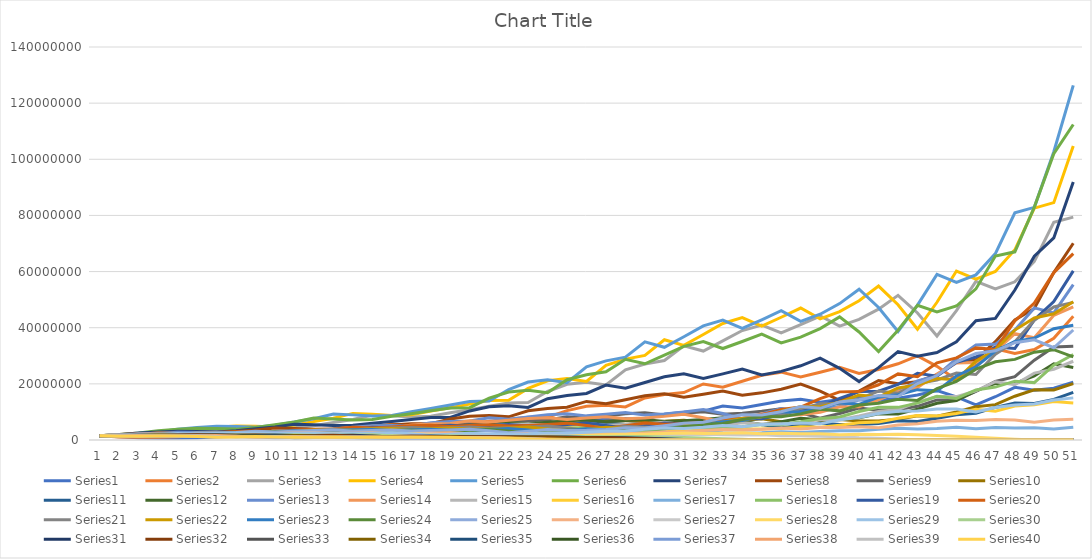
| Category | Series 0 | Series 1 | Series 2 | Series 3 | Series 4 | Series 5 | Series 6 | Series 7 | Series 8 | Series 9 | Series 10 | Series 11 | Series 12 | Series 13 | Series 14 | Series 15 | Series 16 | Series 17 | Series 18 | Series 19 | Series 20 | Series 21 | Series 22 | Series 23 | Series 24 | Series 25 | Series 26 | Series 27 | Series 28 | Series 29 | Series 30 | Series 31 | Series 32 | Series 33 | Series 34 | Series 35 | Series 36 | Series 37 | Series 38 | Series 39 |
|---|---|---|---|---|---|---|---|---|---|---|---|---|---|---|---|---|---|---|---|---|---|---|---|---|---|---|---|---|---|---|---|---|---|---|---|---|---|---|---|---|
| 0 | 1500000 | 1500000 | 1500000 | 1500000 | 1500000 | 1500000 | 1500000 | 1500000 | 1500000 | 1500000 | 1500000 | 1500000 | 1500000 | 1500000 | 1500000 | 1500000 | 1500000 | 1500000 | 1500000 | 1500000 | 1500000 | 1500000 | 1500000 | 1500000 | 1500000 | 1500000 | 1500000 | 1500000 | 1500000 | 1500000 | 1500000 | 1500000 | 1500000 | 1500000 | 1500000 | 1500000 | 1500000 | 1500000 | 1500000 | 1500000 |
| 1 | 1134576 | 1059408 | 1413792 | 1538352 | 1732752 | 1948752 | 1891152 | 1949904 | 1715184 | 1588464 | 1442304 | 1383696 | 1679328 | 1798272 | 1718928 | 1773072 | 1405296 | 1390032 | 1495440 | 1677600 | 1622736 | 1617408 | 1598256 | 1466928 | 1884384 | 1663776 | 1503792 | 1378080 | 1849968 | 1567584 | 1514448 | 1713168 | 1365552 | 1611648 | 1596240 | 1518336 | 1344816 | 1557504 | 1553904 | 1327248 |
| 2 | 794508.387 | 987287.105 | 1449584.234 | 1776388.918 | 2261662.356 | 2479684.665 | 2476535.729 | 2252513.849 | 1826694.554 | 1530477.456 | 1325306.334 | 1536051.606 | 2017744.064 | 2073802.851 | 2040958.206 | 1666823.842 | 1290280.17 | 1376446.944 | 1672966.006 | 1822139.791 | 1749967.989 | 1727049.266 | 1566522.589 | 1840861.535 | 2108086.916 | 1673867.708 | 1379790.25 | 1691233.685 | 1947899.026 | 1584606.081 | 1729592.481 | 1567017.136 | 1460341.336 | 1719151.204 | 1618808.615 | 1360250.523 | 1387857.559 | 1613190.749 | 1373910.508 | 1344624.73 |
| 3 | 731928.376 | 1000209.173 | 1673453.928 | 2317818.884 | 2888597.417 | 3272597.959 | 2877176.102 | 2420747.775 | 1769876.652 | 1409596.472 | 1463986.809 | 1830147.983 | 2331441.271 | 2476678.746 | 1926809.735 | 1537117.374 | 1263199.189 | 1529016.345 | 1817581.082 | 1973149.612 | 1868823.93 | 1696319.77 | 1970548.273 | 2057585.835 | 2138039.289 | 1541647.755 | 1690784.846 | 1773300.256 | 1983936.333 | 1812007.674 | 1581975.948 | 1685006.137 | 1550592.718 | 1747584.272 | 1453166.883 | 1402540.621 | 1428253.316 | 1426063.673 | 1390582.86 | 1391917.285 |
| 4 | 732278.317 | 1140017.458 | 2182991.184 | 2959507.087 | 3824133.077 | 3824616.197 | 3107428.082 | 2366091.785 | 1640429.284 | 1561699.374 | 1735647.634 | 2099082.258 | 2789324.759 | 2350966.008 | 1786447.627 | 1513033.61 | 1386356.218 | 1650159.668 | 1968742.399 | 2115736.072 | 1835791.76 | 2138591.033 | 2206859.983 | 2085103.514 | 1986028.237 | 1897475.205 | 1770546.885 | 1798545.884 | 2286351.073 | 1659281.783 | 1701011.386 | 1798816.138 | 1569049.318 | 1572680.535 | 1501949.845 | 1442005.836 | 1253920.593 | 1443029.835 | 1438017.564 | 1468976.07 |
| 5 | 823291.224 | 1469507.211 | 2786824.661 | 3917113.781 | 4479676.461 | 4151864.04 | 3051690.005 | 2214554.063 | 1831965.663 | 1857005.448 | 1981899.664 | 2494332.524 | 2652135.977 | 2194682.47 | 1770069.844 | 1670185.637 | 1478907.695 | 1775099.474 | 2111565.254 | 2086583.548 | 2314720.646 | 2399423.1 | 2240471.214 | 1935181.665 | 2468602.876 | 1994481.839 | 1793430.266 | 2063774.169 | 2108504.869 | 1786518.257 | 1815819.017 | 1829986.154 | 1405210.522 | 1630323.188 | 1548145.318 | 1264711.854 | 1257809.365 | 1491873.169 | 1515996.113 | 1231165.793 |
| 6 | 1047426.927 | 1858057.316 | 3687976.111 | 4587807.597 | 4872748.766 | 4097170.425 | 2871146.199 | 2503154.594 | 2195727.108 | 2126117.803 | 2345427.511 | 2356611.036 | 2480942.408 | 2192627.745 | 1967529.616 | 1791687.9 | 1571473.734 | 1890986.01 | 2083001.658 | 2641956.31 | 2597302.884 | 2440102.648 | 2083376.771 | 2403022.354 | 2616410.052 | 2027895.648 | 2055150.047 | 1895807.469 | 2288575.698 | 1909586.415 | 1847199.971 | 1648178.675 | 1448311.324 | 1685744.391 | 1361520.003 | 1266988.89 | 1288006.366 | 1572350.467 | 1269125.777 | 946529.586 |
| 7 | 1310156.705 | 2439156.728 | 4318924.885 | 4989635.022 | 4817642.689 | 3875116.406 | 3265911.755 | 3035774.071 | 2531628.424 | 2522321.084 | 2207324.202 | 2187025.472 | 2484742.186 | 2458260.961 | 2124708.304 | 1915190.834 | 1653585.835 | 1853064.931 | 2638128.43 | 2974554.118 | 2641591.104 | 2273039.288 | 2592730.407 | 2544798.327 | 2682172.245 | 2332896.437 | 1885581.886 | 2048579.887 | 2465401.835 | 1945085.645 | 1663603.172 | 1710247.783 | 1488423.768 | 1487508.591 | 1368745.795 | 1295543.853 | 1343763.993 | 1315928.753 | 974134.943 | 1074677.761 |
| 8 | 1704107.847 | 2839060.946 | 4696726.24 | 4932527.346 | 4565839.1 | 4435891.098 | 3984945.686 | 3536205.57 | 3022869.654 | 2379368.097 | 2038426.47 | 2169491.742 | 2792834.698 | 2676199.24 | 2287028.464 | 2027398.661 | 1600680.451 | 2330490.552 | 2970888.037 | 3034786.65 | 2460979.549 | 2834480.165 | 2750734.027 | 2606641.798 | 3111511.904 | 2148003.17 | 2034689.17 | 2197415.557 | 2530446.295 | 1754121.993 | 1726155.476 | 1770186.926 | 1304816.99 | 1501775.655 | 1405005.964 | 1349543.087 | 1112431.666 | 1009650.569 | 1103215.254 | 1210898.483 |
| 9 | 1969458.961 | 3071239.672 | 4642529.715 | 4674024.664 | 5239286.091 | 5445050.545 | 4665967.861 | 4261718.214 | 2868922.417 | 2203836.785 | 2009966.954 | 2414439.034 | 3047618.262 | 2904835.21 | 2437866.741 | 1974378.239 | 1986632.268 | 2609506.562 | 3031652.486 | 2836540.45 | 3069191.422 | 3012268.28 | 2822655.389 | 3021405.921 | 2886543.778 | 2327237.305 | 2179563.852 | 2245996.44 | 2300159.703 | 1822993.428 | 1786546.219 | 1563714.157 | 1306388.484 | 1548758.162 | 1469634.096 | 1115345.233 | 840210.38 | 1142709.595 | 1239830.204 | 1063070.907 |
| 10 | 2117388.207 | 3020799.477 | 4398774.294 | 5362480.862 | 6445917.945 | 6407957.174 | 5649351.298 | 4079559.202 | 2677613.079 | 2180976.682 | 2222810.609 | 2610322.444 | 3315979.689 | 3121925.187 | 2390454.44 | 2466497.417 | 2200249.025 | 2648814.161 | 2834198.597 | 3550671.606 | 3262009.812 | 3096108.81 | 3277746.752 | 2800896.7 | 3154026.5 | 2502696.11 | 2224802.517 | 2032791.955 | 2412837.232 | 1889933.831 | 1578065.848 | 1580872.834 | 1334949.844 | 1628036.428 | 1220047.78 | 840346.453 | 927244.555 | 1283377.442 | 1085557.611 | 1007253.046 |
| 11 | 2070366.16 | 2846864.509 | 5046072.256 | 6596391.967 | 7600349.012 | 7793273.344 | 5430789.992 | 3848101.439 | 2674394.648 | 2421182.771 | 2388722.734 | 2813110.502 | 3572156.63 | 3085782.384 | 3008310.427 | 2746623.903 | 2210448.325 | 2462663.26 | 3548569.82 | 3785290.733 | 3353111.053 | 3601242.503 | 3043459.957 | 3057931.831 | 3419407.147 | 2564394.853 | 2010835.52 | 2121604.982 | 2525653.441 | 1672358.129 | 1595255.198 | 1632760.125 | 1389603.341 | 1358742.615 | 925260.726 | 923660.193 | 1014078.596 | 1122927.05 | 1024797.782 | 1008857.299 |
| 12 | 1938579.205 | 3244865.379 | 6206467.558 | 7776694.249 | 9258993.05 | 7522192.878 | 5149094.992 | 3892102.505 | 2997571.421 | 2611433.122 | 2558131.709 | 3002198.633 | 3538790.722 | 3916254.851 | 3370288.835 | 2773630.33 | 2032750.533 | 3064143.712 | 3783778.871 | 3902604.195 | 3900537.205 | 3348753.373 | 3328781.627 | 3312647.005 | 3531182.925 | 2326960.426 | 2095281.842 | 2209254.904 | 2257597.519 | 1694360.301 | 1647472.115 | 1719039.412 | 1147565.372 | 1038361.371 | 1027922.338 | 1005744.256 | 862533.185 | 1059092.705 | 1021415.508 | 1071433.249 |
| 13 | 2192335.38 | 3966913.663 | 7316299.883 | 9472671.334 | 8950463.106 | 7166963.725 | 5239303.688 | 4418595.884 | 3262487.639 | 2807382.127 | 2713054.748 | 2947233.995 | 4501790.849 | 4417600.599 | 3422771.031 | 2564710.303 | 2497497.255 | 3250343.019 | 3901774.936 | 4553307.198 | 3627362.901 | 3668700.505 | 3612255.055 | 3418383.899 | 3230033.549 | 2435988.02 | 2178170.749 | 1964054.463 | 2316195.64 | 1754073.712 | 1734370.751 | 1437098.333 | 863640.612 | 1167835.06 | 1132242.937 | 851333.875 | 781419.443 | 1054282.038 | 1077801.927 | 949473.205 |
| 14 | 2660131.01 | 4652458.789 | 8911124.125 | 9156020.762 | 8543267.888 | 7333745.289 | 5983774.194 | 4866181.731 | 3540282.958 | 2988790.304 | 2646998.946 | 3713582.012 | 5087727.304 | 4514893.759 | 3183899.399 | 3171245.084 | 2621219.847 | 3334791.503 | 4553190.434 | 4245608.693 | 3974293.174 | 3987284.134 | 3733682.89 | 3124479.648 | 3412977.755 | 2544563.311 | 1932991.1 | 2001521.803 | 2430210.875 | 1851315.054 | 1449774.613 | 1100874.829 | 947483.427 | 1303102.483 | 970542.54 | 765795.169 | 734902.219 | 1110646.148 | 947667.397 | 985982.461 |
| 15 | 3099952.258 | 5641173.821 | 8612594.826 | 8738331.118 | 8760250.731 | 8422559.892 | 6625765.841 | 5344069.55 | 3803890.816 | 2927051.046 | 3313369.929 | 4164618.321 | 5208832.81 | 4227559.866 | 3963906.024 | 3346392.772 | 2661113.942 | 3871825.775 | 4246199.591 | 4665306.67 | 4319787.148 | 4127402.284 | 3418382.864 | 3298559.638 | 3599067.881 | 2269556.993 | 1965522.102 | 2085092.374 | 2600794.171 | 1551726.48 | 1110431.757 | 1242851.396 | 1029571.681 | 1132484.674 | 889271.863 | 712569.813 | 714112.416 | 974569.815 | 972995.019 | 1017073.397 |
| 16 | 3737379.098 | 5430079.906 | 8218953.227 | 8958929.321 | 10081343.223 | 9372822.188 | 7315902.692 | 5808457.832 | 3758924.305 | 3678764.072 | 3695764.337 | 4233440.06 | 4886096.458 | 5302626.676 | 4206877.228 | 3415673.164 | 3056598.805 | 3594556.548 | 4666806.339 | 5084845.534 | 4471957.674 | 3784516.008 | 3615785.338 | 3475338.158 | 3241705.496 | 2322237.66 | 2042749.382 | 2215113.592 | 2211727.828 | 1193107.675 | 1253366.886 | 1392268.389 | 869526.977 | 1058129.6 | 850277.899 | 681107.28 | 561870.42 | 997645.491 | 990028.75 | 937805.811 |
| 17 | 3578878.388 | 5156635.683 | 8425569.64 | 10308477.208 | 11239078.36 | 10400094.21 | 7992415.3 | 5803330.997 | 4769325.417 | 4116988.04 | 3737898.121 | 3941858.945 | 6140976.81 | 5662436.816 | 4318286.092 | 3945031.072 | 2810383.176 | 3930909.884 | 5087348.858 | 5277736.531 | 4100789.101 | 4009936.466 | 3816969.789 | 3127428.581 | 3356862.245 | 2429657.235 | 2164804.653 | 1869451.932 | 1735246.886 | 1354867.961 | 1403731.507 | 1214959.586 | 779513.918 | 1039960.37 | 846860.608 | 522693.525 | 477634.153 | 1011420.265 | 897592.943 | 979228.428 |
| 18 | 3377264.999 | 5256665.143 | 9693794.556 | 11490805.162 | 12493019.19 | 11414243.383 | 8023890.375 | 7447669.677 | 5378758.887 | 4176907.821 | 3462021.078 | 4913039.427 | 6568498.29 | 5847361.497 | 5016173.049 | 3645408.427 | 3040007.836 | 4265009.642 | 5281188.614 | 4852485.976 | 4345462.422 | 4240364.879 | 3441691.951 | 3234984.209 | 3556432.447 | 2592671.37 | 1822300.582 | 1451354.689 | 2032116.368 | 1526866.757 | 1224675.073 | 1141689.95 | 721618.803 | 1076874.26 | 690429.469 | 422140.572 | 362704.131 | 912799.435 | 915190.55 | 947141.779 |
| 19 | 3417586.932 | 6014587.878 | 10804652.276 | 12771210.708 | 13733892.108 | 11508488.846 | 10348032.564 | 8475988.87 | 5496168.364 | 3881325.458 | 4288863.139 | 5219033.436 | 6793829.959 | 6833328.537 | 4658997.139 | 3965636.526 | 3264148.336 | 4407738.677 | 4856451.291 | 5157521.744 | 4595611.698 | 3830193.618 | 3568604.756 | 3423424.919 | 3843569.695 | 2198232.901 | 1409668.076 | 1672917.498 | 2360859.969 | 1340702.813 | 1150445.714 | 1130874.18 | 684197.747 | 924798.813 | 627427.646 | 287271.164 | 188935.368 | 924547.833 | 859726.215 | 778651.95 |
| 20 | 3881835.932 | 6670842.24 | 12007547.147 | 14038060.268 | 13868471.891 | 14906408.897 | 11822259.847 | 8733056.64 | 5145366.643 | 4826401.748 | 4532940.073 | 5362117.794 | 7951983.158 | 6380604.075 | 5097445.95 | 4281248.422 | 3339582.573 | 4034919.278 | 5162693.111 | 5470889.553 | 4151481.879 | 3979842.683 | 3785864.481 | 3695621.742 | 3301394.998 | 1717582.083 | 1615926.156 | 1913768.794 | 2136961.505 | 1270613.973 | 1139044.49 | 1183461.094 | 518462.308 | 916361.167 | 537229.273 | 99021.684 | 0 | 861242.421 | 678860.153 | 679506.181 |
| 21 | 4277001.175 | 7377662.015 | 13197568.464 | 14174074.659 | 17990761.425 | 17087626.216 | 12223155.191 | 8245389.886 | 6452396.248 | 5117127.373 | 4634069.399 | 6234406.484 | 7435488.211 | 7022354.748 | 5533252.033 | 4403355.755 | 3025645.546 | 4267200.163 | 5477388.027 | 4957310.849 | 4314188.299 | 4231349.423 | 4097044.393 | 3170676.933 | 2625407.462 | 1999105.21 | 1838453.943 | 1706164.482 | 2107804.376 | 1273046.209 | 1191305.213 | 1029979.643 | 407349.928 | 891219.553 | 372253.988 | 0 | 0 | 671847.352 | 551370.138 | 579720.461 |
| 22 | 4699174.187 | 8072210.366 | 13324433.938 | 18385192.455 | 20647834.584 | 17720509.457 | 11581235.708 | 10438197.133 | 6888965.978 | 5247501.314 | 5360833.962 | 5795200.436 | 8195888.405 | 7665093.806 | 5720949.156 | 4011204.347 | 3161616.494 | 4503858.576 | 4964127.468 | 5170472.842 | 4587375.217 | 4589097.455 | 3523895.16 | 2517583.486 | 3135942.707 | 2308780.512 | 1630012.261 | 1650190.523 | 2221877.983 | 1352576.609 | 1036040.401 | 1041586.955 | 259245.176 | 761276.175 | 211010.672 | 0 | 0 | 533109.638 | 410439.025 | 355728.089 |
| 23 | 5109740.933 | 8115585.98 | 17281816.346 | 21098734.602 | 21435266.909 | 16841003.069 | 14717995.866 | 11230648.648 | 7112689.684 | 6089538.751 | 4960811.66 | 6346325.849 | 8958841.165 | 7966908.234 | 5239406.246 | 4218195.005 | 3296307.615 | 4060336.944 | 5178736.112 | 5518505.212 | 4975818.372 | 3955721.879 | 2807434.049 | 3000499.967 | 3711622.677 | 2077787.717 | 1565083.611 | 1697627.531 | 2513553.148 | 1199221.245 | 1046552.478 | 1040045.459 | 58887.517 | 707600.474 | 0 | 0 | 0 | 377126.431 | 179857.963 | 164417.716 |
| 24 | 5107327.088 | 10481437.429 | 19831345.846 | 21901713.702 | 20393025.638 | 21473563.197 | 15884705.391 | 11681522.895 | 8310549.274 | 5650959.005 | 5405332.795 | 6894805.871 | 9324160.704 | 7335214.988 | 5543882.256 | 4426680.629 | 2934261.638 | 4209175.53 | 5528580.581 | 6008024.045 | 4289581.463 | 3160608.36 | 3362102.545 | 3544052.107 | 3419548.155 | 2034368.047 | 1595116.129 | 1865195.028 | 2391919.726 | 1246239.152 | 1043536.201 | 920499.066 | 0 | 583543.418 | 0 | 0 | 0 | 138124.18 | 0 | 0 |
| 25 | 6557211.425 | 11988204.58 | 20585017.781 | 20835221.701 | 26032708.974 | 23237398.754 | 16571359.925 | 13749160.607 | 7758753.285 | 6176690.166 | 5844547.739 | 7134511.956 | 8596480.4 | 7808694.536 | 5854383.539 | 3967315.906 | 2995055.851 | 4464462.541 | 6020341.885 | 5198618.218 | 3427904.683 | 3800736.073 | 3988840.841 | 3258913.983 | 3447940.192 | 2125167.912 | 1732327.02 | 1719450.282 | 2729244.769 | 1286648.622 | 921891.751 | 905604.445 | 0 | 369160.404 | 0 | 0 | 0 | 0 | 0 | 0 |
| 26 | 7465055.368 | 12407287.305 | 19581619.609 | 26595015.14 | 28196943.373 | 24302798.379 | 19561072.363 | 12918665.192 | 8537657.233 | 6698538.569 | 6020194.179 | 6539404.909 | 9165413.054 | 8296246.817 | 5280665.837 | 4083461.012 | 3125479.342 | 4830370.621 | 5210436.356 | 4174671.862 | 4123098.359 | 4526323.088 | 3683160.825 | 3278282.299 | 3730653.517 | 2378664.138 | 1576051.585 | 1884864.143 | 3116638.305 | 1187615.702 | 904423.066 | 811742.46 | 0 | 159617.123 | 0 | 0 | 0 | 0 | 0 | 0 |
| 27 | 7693766.105 | 11767712.132 | 24993443.202 | 28804119.971 | 29515280.141 | 28757576.429 | 18425642.482 | 14315590.013 | 9317600.245 | 6919619.005 | 5492424.466 | 6926003.548 | 9752514.674 | 7529443.467 | 5477732.875 | 4299046.527 | 3326284.342 | 4153726.184 | 4185386.838 | 5056079.136 | 4911235 | 4194116.186 | 3723842.276 | 3537450.666 | 4347300.701 | 2237983.045 | 1697683.04 | 2066253.532 | 3211021.948 | 1241868.665 | 807554.543 | 596976.511 | 0 | 0 | 0 | 0 | 0 | 0 | 0 | 0 |
| 28 | 7266345.929 | 14971714.041 | 27068292.711 | 30148995.939 | 34954897.131 | 27145406.122 | 20473671.614 | 15725407.3 | 9683022.238 | 6331463.806 | 5786068.118 | 7320907.699 | 8864688.997 | 7868125.846 | 5813786.652 | 4616732.355 | 2812433.984 | 3308246.659 | 5071139.873 | 6060261.034 | 4551640.028 | 4258441.57 | 4041832.091 | 4109769.861 | 4264295.718 | 2518072.868 | 1826169.917 | 2041720.673 | 3839676.569 | 1203251.538 | 590195.392 | 417534.65 | 0 | 0 | 0 | 0 | 0 | 0 | 0 | 0 |
| 29 | 9201873.534 | 16173015.922 | 28330918.925 | 35703281.581 | 33019123.881 | 30231300.28 | 22546296.824 | 16442282.444 | 8913907.39 | 6692461.949 | 6082978.822 | 6609910.731 | 9280278.807 | 8413985.016 | 6294423.041 | 3940020.877 | 2189077.673 | 3960207.75 | 6080557.016 | 5648771.003 | 4622503.698 | 4644571.664 | 4726192.727 | 4019225.56 | 5042597.635 | 2835782.711 | 1767740.632 | 2328928.67 | 4276356.347 | 991476.788 | 406710.018 | 205142.552 | 0 | 0 | 0 | 0 | 0 | 0 | 0 | 0 |
| 30 | 9903149.865 | 16886449.066 | 33548881.762 | 33724342.194 | 36801339.936 | 33361092.644 | 23629064.659 | 15228997.731 | 9487657.935 | 7059912.499 | 5461863.375 | 6864619.857 | 9942414.12 | 9177791.891 | 5416272.257 | 3106172.659 | 2533179.206 | 4696639.17 | 5669595.497 | 5776143.522 | 5042957.21 | 5459827.608 | 4651813.163 | 4736526.568 | 5956108.355 | 2881510.957 | 1966914.819 | 2480266.995 | 4132230.74 | 868576.425 | 188740.008 | 0 | 0 | 0 | 0 | 0 | 0 | 0 | 0 | 0 |
| 31 | 10303391.716 | 19949508.599 | 31688234.911 | 37585273.731 | 40640144.459 | 35030701.607 | 21936022.169 | 16321174.857 | 10078315.117 | 6361261.911 | 5634485.95 | 7294555.343 | 10864591.202 | 7956352.872 | 4317608.61 | 3663643.912 | 2909107.809 | 4335171.781 | 5799756.288 | 6350570.801 | 5929816.168 | 5401904.136 | 5522215.78 | 5577040.082 | 6336431.279 | 3393789.928 | 2042380.451 | 2288596.174 | 4512449.368 | 745910.785 | 0 | 0 | 0 | 0 | 0 | 0 | 0 | 0 | 0 | 0 |
| 32 | 12130177.043 | 18804946.544 | 35314718.939 | 41503771.923 | 42702026.111 | 32582657.094 | 23569884.578 | 17455604.003 | 9145221.243 | 6590173.83 | 5945995.018 | 7907110.567 | 9435502.993 | 6405068.035 | 5175011.039 | 4285355.677 | 2603522.125 | 4381156.792 | 6379396.178 | 7529956.299 | 5868524.21 | 6450263.127 | 6545664.82 | 5916002.636 | 7835264.427 | 3727432.111 | 1832431.495 | 2364013.965 | 5173724.351 | 463571.273 | 0 | 0 | 0 | 0 | 0 | 0 | 0 | 0 | 0 | 0 |
| 33 | 11399983.148 | 20911272.282 | 38995144.062 | 43607452.642 | 39743524.035 | 35083673.505 | 25271852.71 | 15947787.681 | 9554625.066 | 6985190.282 | 6400668.263 | 6812185.038 | 7613570.479 | 7784331.444 | 6144454.838 | 3904388.661 | 2530813.885 | 4752905.206 | 7567761.176 | 7512537.443 | 7009602.374 | 7686113.361 | 6986166.549 | 7293925.628 | 8986950.251 | 3551990.337 | 1824561.345 | 2552673.327 | 4764321.558 | 226582.903 | 0 | 0 | 0 | 0 | 0 | 0 | 0 | 0 | 0 | 0 |
| 34 | 12635715.63 | 23044501.368 | 40970358.223 | 40584373.457 | 42824840.497 | 37694705.981 | 23146768.925 | 16796122.478 | 10215359.182 | 7552641.788 | 5475794.099 | 5439090.372 | 9283194.329 | 9359392.933 | 5677664.734 | 3882983.575 | 2620159.05 | 5554623.269 | 7553727.068 | 9053969.551 | 8354928.679 | 8242719.555 | 8666878.2 | 8345102.24 | 8932152.94 | 3816519.059 | 1885940.366 | 2209716.507 | 5540957.366 | 0 | 0 | 0 | 0 | 0 | 0 | 0 | 0 | 0 | 0 | 0 |
| 35 | 13883162.722 | 24167053.101 | 38128892.908 | 43728675.155 | 46044010.285 | 34595402.729 | 24449417.809 | 18103708.1 | 11140411.135 | 6490283.584 | 4331185.089 | 6534149.953 | 11193863.186 | 8748552.843 | 5745388.229 | 4133940.146 | 2901237.516 | 5464253.391 | 9108210.945 | 10877823.851 | 8962205.313 | 10274804.316 | 9968304.09 | 8274862.264 | 10064285.346 | 4303086.69 | 1552655.679 | 2372632.713 | 5665485.171 | 0 | 0 | 0 | 0 | 0 | 0 | 0 | 0 | 0 | 0 | 0 |
| 36 | 14519044.906 | 22450020.518 | 41081518.64 | 47013483.332 | 42287183.081 | 36628919.214 | 26429763.639 | 19899696.877 | 9655816.964 | 5164556.332 | 5133230.52 | 7774474.601 | 10490680.878 | 8975811.687 | 6242265.99 | 4730507.42 | 2697736.709 | 6482706.546 | 10947860.222 | 11751939.411 | 11174441.345 | 11865403.905 | 9932947.186 | 9300149.859 | 11901314.072 | 3897605.62 | 1548158.204 | 2237319.063 | 6090505.396 | 0 | 0 | 0 | 0 | 0 | 0 | 0 | 0 | 0 | 0 | 0 |
| 37 | 13450427.639 | 24139597.706 | 44165978.308 | 43175472.301 | 44808363.197 | 39688835.757 | 29133572.132 | 17382259.227 | 7771117.403 | 6174370.008 | 6031665.922 | 7197808.552 | 10796403.991 | 9905488.098 | 7307233.331 | 4555674.933 | 2990529.193 | 7679905.867 | 11832282.403 | 14756346.603 | 12906996.614 | 11867314.671 | 11222840.456 | 10971076.574 | 11283117.685 | 4442020.171 | 1336655.168 | 2189546.066 | 5753994.111 | 0 | 0 | 0 | 0 | 0 | 0 | 0 | 0 | 0 | 0 | 0 |
| 38 | 14418352.451 | 25900957.8 | 40559071.514 | 45747059.126 | 48589694.073 | 43847743.426 | 25517682.414 | 14131163.951 | 9441044.159 | 7313853.672 | 5519253.757 | 7300784.612 | 11955537.134 | 11791971.012 | 7200031.236 | 5273271.73 | 3317025.795 | 8192588.337 | 14862993.008 | 17144461.834 | 12911541.829 | 13461761.792 | 13306310.793 | 10378136.394 | 13575259.943 | 4454902.559 | 1155408.495 | 1863780.025 | 7227087.092 | 0 | 0 | 0 | 0 | 0 | 0 | 0 | 0 | 0 | 0 | 0 |
| 39 | 15423988.938 | 23739521.35 | 42973159.629 | 49604869.141 | 53721626.301 | 38489418.854 | 20817871.508 | 17408367.011 | 11347562.989 | 6743496.962 | 5518608.589 | 7953548.588 | 14284017.739 | 11809602.524 | 8557703.613 | 6105739.457 | 3318407.111 | 10158362.627 | 17273905.344 | 17242477.482 | 14649267.74 | 16021074.422 | 12645427.564 | 12455078.986 | 14313356.206 | 4689722.808 | 824182.731 | 2044721.437 | 8018244.924 | 0 | 0 | 0 | 0 | 0 | 0 | 0 | 0 | 0 | 0 | 0 |
| 40 | 14094813.856 | 25095875.067 | 46595267.375 | 54841129.381 | 47190852.395 | 31487907.336 | 25768316.684 | 21182113.767 | 10603782.453 | 6805865.754 | 5912888.325 | 9337849.122 | 14354557.753 | 14292214.108 | 10154979.279 | 6375546.53 | 3840110.596 | 11678718.551 | 17377714.794 | 19674202.73 | 17437694.834 | 15277365.311 | 15255503.96 | 13103291.281 | 15882065.875 | 4336213.872 | 648432.849 | 1986513.274 | 9469623.111 | 0 | 0 | 0 | 0 | 0 | 0 | 0 | 0 | 0 | 0 | 0 |
| 41 | 14848463.499 | 27150455.21 | 51511952.445 | 48171811.754 | 38642049.413 | 39122058.782 | 31484036.289 | 20012583.676 | 10875374.421 | 7371902.496 | 6815349.757 | 9227410.108 | 17437084.641 | 17234242.279 | 10849334.815 | 7733425.043 | 4147720.357 | 11632655.641 | 19834585.2 | 23543937.989 | 16631107.934 | 18501220.74 | 16123019.597 | 14507259.276 | 15474637.725 | 5309806.568 | 351158.79 | 2025496.25 | 10231872.365 | 0 | 0 | 0 | 0 | 0 | 0 | 0 | 0 | 0 | 0 | 0 |
| 42 | 16008609.477 | 29951184.105 | 45245906.519 | 39442756.905 | 48070095.372 | 47954077.199 | 29854274.348 | 20790655.806 | 11997047.418 | 8600698.467 | 6612254.186 | 11002997.693 | 21094890.601 | 18679658.288 | 13473101.414 | 8723587.331 | 3885007.134 | 13137646.899 | 23742650.072 | 22562330.508 | 20144528.683 | 19618320.93 | 17932255.011 | 14105541.507 | 20116267.399 | 5761074.301 | 0 | 1879618.8 | 10321495.021 | 0 | 0 | 0 | 0 | 0 | 0 | 0 | 0 | 0 | 0 | 0 |
| 43 | 17601204.814 | 26253514.173 | 37045386.429 | 49061912.511 | 58984540.346 | 45600339.161 | 31145245.916 | 23261972.528 | 14275870.629 | 8446496.71 | 7720765.801 | 13094907.258 | 22929599.14 | 23529697.034 | 15509523.405 | 8534920.194 | 4088751.038 | 15570245.012 | 22758564.722 | 27473929.944 | 21364429.142 | 21891674.093 | 17511056.571 | 18295055.55 | 22965841.895 | 6656112.056 | 0 | 1591038.351 | 10999671.087 | 0 | 0 | 0 | 0 | 0 | 0 | 0 | 0 | 0 | 0 | 0 |
| 44 | 15378332.656 | 21438725.039 | 46077112.066 | 60197095.336 | 56141200.196 | 47725932.957 | 35005766.591 | 28093137.644 | 14291500.008 | 10001613.509 | 9013396.71 | 14027476.189 | 28963536.66 | 27409286.892 | 15466763.144 | 9451984.672 | 4508491.305 | 14791435.123 | 27720692.43 | 29270955.184 | 23844062.87 | 21443476.921 | 22817960.967 | 20848507.949 | 27858785.317 | 7049501.045 | 0 | 1350459.659 | 11076988.876 | 0 | 0 | 0 | 0 | 0 | 0 | 0 | 0 | 0 | 0 | 0 |
| 45 | 12506008.291 | 26571216.572 | 56531956.194 | 57291605.243 | 58819900.231 | 53827798.465 | 42472979.641 | 28517545.971 | 17288310.806 | 11828050.024 | 9485271.134 | 17466165.319 | 33816098.263 | 27631352.634 | 17490135.52 | 10990902.403 | 3991407.65 | 17837020.067 | 29540990.062 | 32815115.129 | 23359501.678 | 28034500.961 | 26100337.967 | 25248218.538 | 30810360.104 | 6970645.2 | 0 | 1013007.291 | 9964499.311 | 0 | 0 | 0 | 0 | 0 | 0 | 0 | 0 | 0 | 0 | 0 |
| 46 | 15412981.526 | 32501290.975 | 53800959.411 | 60020789.92 | 66414692.607 | 65540514.768 | 43299861.231 | 35017228.42 | 20839129.481 | 12597550.886 | 11599248.171 | 20151140.009 | 34160190.67 | 31606774.037 | 20753863.172 | 10258572.54 | 4417661.14 | 18844480.004 | 33125669.694 | 32282605.762 | 30544482.5 | 32152048.494 | 31716430.231 | 27883688.128 | 31780446.8 | 7269578.184 | 0 | 585430.138 | 11570298.165 | 0 | 0 | 0 | 0 | 0 | 0 | 0 | 0 | 0 | 0 | 0 |
| 47 | 18761230.825 | 30849095.221 | 56360991.48 | 67765329.156 | 80958255.869 | 67032176.254 | 53409921.034 | 42757379.434 | 22579270.138 | 15595203.666 | 13177656.699 | 20137041.757 | 39158994.221 | 37911279.232 | 19737564.882 | 12123128.295 | 4302398.746 | 20951521.518 | 32595246.244 | 42399593.281 | 35035286.257 | 39163764.301 | 35128624.625 | 28723498.596 | 34660789.133 | 7160760.042 | 0 | 232467.927 | 12426123.072 | 0 | 0 | 0 | 0 | 0 | 0 | 0 | 0 | 0 | 0 | 0 |
| 48 | 17731272.071 | 32219216.689 | 63629843.388 | 82598108.926 | 82886590.034 | 82963151.48 | 65466100.249 | 46852701.93 | 28432466.988 | 17904871.458 | 12980336.493 | 22821622.746 | 47063585.462 | 36405767.564 | 23831132.719 | 12579445.956 | 4379932.108 | 20452445.989 | 42820109.082 | 48804809.551 | 42680841.372 | 43464698.098 | 36284755.259 | 31284595.701 | 35700817.516 | 6291398.971 | 0 | 0 | 12839857.833 | 0 | 0 | 0 | 0 | 0 | 0 | 0 | 0 | 0 | 0 | 0 |
| 49 | 18427735.937 | 36256607.168 | 77553163.814 | 84559404.381 | 102696410.154 | 101979530.349 | 71973381.798 | 59643045.957 | 33111474.906 | 17811752.809 | 14483348.413 | 27136858.421 | 45274616.463 | 44431963.095 | 25204411.366 | 13733303.53 | 3905015.863 | 26641029.48 | 49297864.324 | 59643674.071 | 47372748.004 | 44979490.997 | 39628745.399 | 32181878.084 | 32863240.716 | 7099094.65 | 0 | 0 | 14280106.536 | 0 | 0 | 0 | 0 | 0 | 0 | 0 | 0 | 0 | 0 | 0 |
| 50 | 20626797.532 | 44044819.657 | 79390693.567 | 104761152.203 | 126350182.431 | 112388612.884 | 91909166.985 | 70076005.394 | 33371589.403 | 20088877.352 | 16966092.562 | 25856879.079 | 55363447.353 | 47430432.114 | 28052729.204 | 13174120.29 | 4567854.911 | 30464418.608 | 60256103.525 | 66376356.958 | 49028288.236 | 49217941.251 | 40872272.86 | 29585943.035 | 39185983.975 | 7421516.516 | 0 | 0 | 15004024.287 | 0 | 0 | 0 | 0 | 0 | 0 | 0 | 0 | 0 | 0 | 0 |